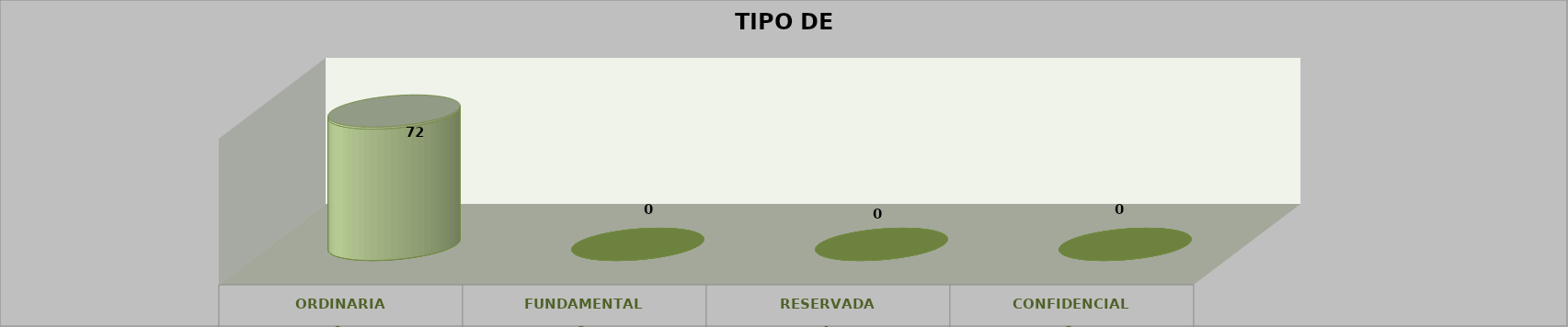
| Category | Series 0 | Series 2 | Series 1 | Series 3 | Series 4 |
|---|---|---|---|---|---|
| 0 |  |  |  | 72 | 1 |
| 1 |  |  |  | 0 | 0 |
| 2 |  |  |  | 0 | 0 |
| 3 |  |  |  | 0 | 0 |